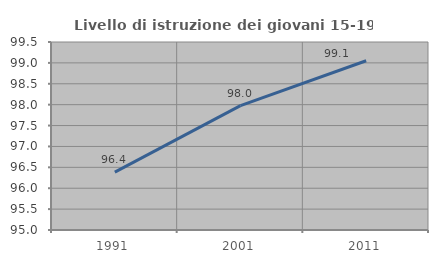
| Category | Livello di istruzione dei giovani 15-19 anni |
|---|---|
| 1991.0 | 96.384 |
| 2001.0 | 97.979 |
| 2011.0 | 99.051 |